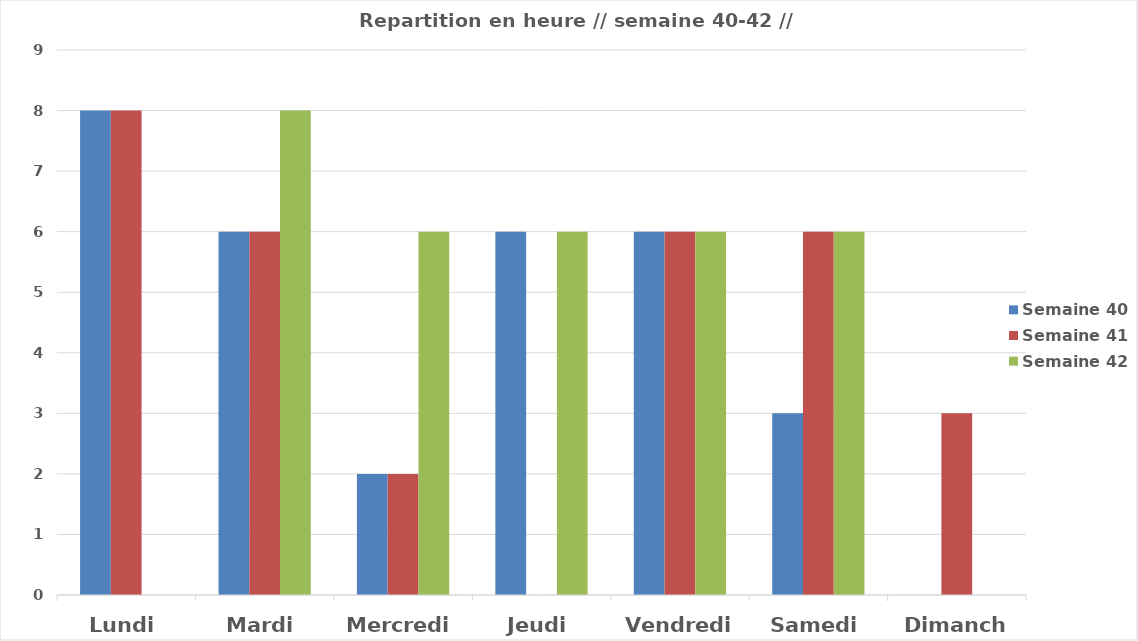
| Category | Semaine 40 | Semaine 41 | Semaine 42 |
|---|---|---|---|
| Lundi | 8 | 8 | 0 |
| Mardi | 6 | 6 | 8 |
| Mercredi | 2 | 2 | 6 |
| Jeudi | 6 | 0 | 6 |
| Vendredi | 6 | 6 | 6 |
| Samedi | 3 | 6 | 6 |
| Dimanche | 0 | 3 | 0 |